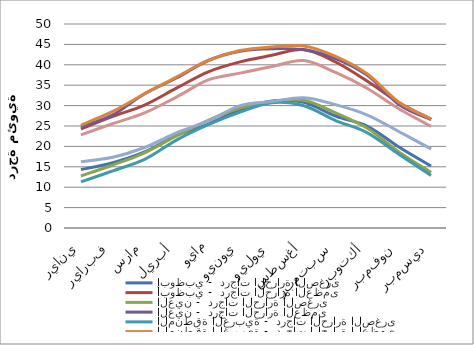
| Category | أبوظبي -  درجات الحرارة الصغرى  | أبوظبي -  درجات الحرارة العظمى  | العين -  درجات الحرارة الصغرى | العين -  درجات الحرارة العظمى | المنطقة الغربية -  درجات الحرارة الصغرى | المنطقة الغربية -  درجات الحرارة العظمى | جزر أبوظبي -  درجات الحرارة الصغرى | جزر أبوظبي -  درجات الحرارة العظمى |
|---|---|---|---|---|---|---|---|---|
| يناير | 14.32 | 24.26 | 12.75 | 24.756 | 11.295 | 25.235 | 16.267 | 22.821 |
| فبراير | 15.995 | 27.337 | 15.435 | 27.713 | 14.006 | 28.584 | 17.351 | 25.581 |
| مارس | 18.637 | 30.117 | 18.436 | 32.887 | 16.802 | 32.905 | 19.728 | 28.205 |
| أبريل | 22.661 | 34.271 | 22.579 | 36.759 | 21.531 | 36.98 | 23.338 | 32.078 |
| مايو | 25.474 | 38.282 | 26.405 | 41.053 | 25.313 | 41.068 | 26.228 | 36.297 |
| يونيو | 28.968 | 40.717 | 29.419 | 43.313 | 28.412 | 43.492 | 30.007 | 37.957 |
| يوليو | 31.13 | 42.324 | 30.939 | 43.933 | 30.716 | 44.372 | 30.989 | 39.581 |
| أغسطس | 30.823 | 43.726 | 31.316 | 43.665 | 29.956 | 44.616 | 31.937 | 41.038 |
| سبتمبر | 27.45 | 40.683 | 28.216 | 41.536 | 26.343 | 42.057 | 30.245 | 38.113 |
| أكتوبر | 24.931 | 35.965 | 24.448 | 37.401 | 23.319 | 37.732 | 27.692 | 34.192 |
| نوفمبر | 19.809 | 30.699 | 18.593 | 30.195 | 18.016 | 30.758 | 23.596 | 29.159 |
| ديسمبر | 15.188 | 26.663 | 13.62 | 26.553 | 12.882 | 26.712 | 19.403 | 24.93 |